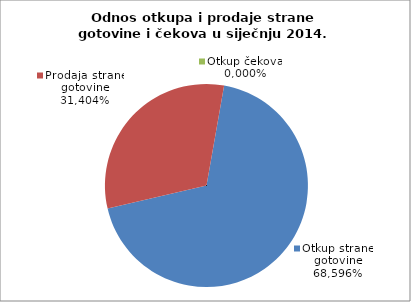
| Category | Otkup strane gotovine | Prodaja strane gotovine | Otkup čekova |
|---|---|---|---|
|  | 0.686 | 0.314 | 0 |